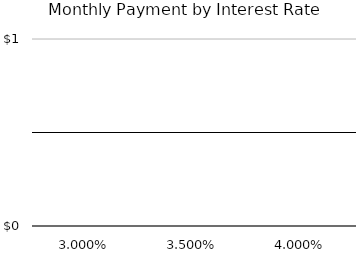
| Category | Series1 |
|---|---|
| 3.000% | 0 |
| 3.500% | 0 |
| 4.000% | 0 |